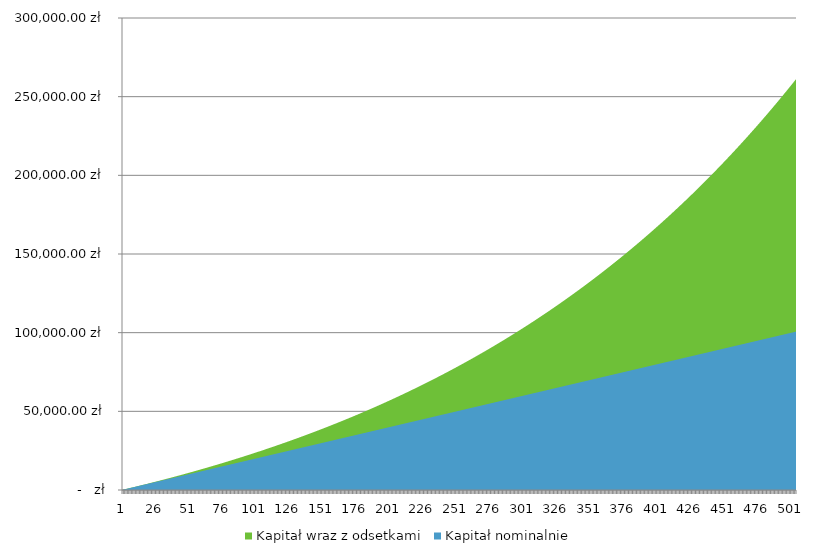
| Category | Kapitał wraz z odsetkami | Kapitał nominalnie |
|---|---|---|
| 0 | 200.667 | 200 |
| 1 | 402.002 | 400 |
| 2 | 604.009 | 600 |
| 3 | 806.689 | 800 |
| 4 | 1010.045 | 1000 |
| 5 | 1214.078 | 1200 |
| 6 | 1418.792 | 1400 |
| 7 | 1624.188 | 1600 |
| 8 | 1830.268 | 1800 |
| 9 | 2037.036 | 2000 |
| 10 | 2244.493 | 2200 |
| 11 | 2452.641 | 2400 |
| 12 | 2661.483 | 2600 |
| 13 | 2871.021 | 2800 |
| 14 | 3081.258 | 3000 |
| 15 | 3292.196 | 3200 |
| 16 | 3503.836 | 3400 |
| 17 | 3716.182 | 3600 |
| 18 | 3929.236 | 3800 |
| 19 | 4143 | 4000 |
| 20 | 4357.477 | 4200 |
| 21 | 4572.669 | 4400 |
| 22 | 4788.578 | 4600 |
| 23 | 5005.206 | 4800 |
| 24 | 5222.557 | 5000 |
| 25 | 5440.632 | 5200 |
| 26 | 5659.434 | 5400 |
| 27 | 5878.966 | 5600 |
| 28 | 6099.229 | 5800 |
| 29 | 6320.226 | 6000 |
| 30 | 6541.96 | 6200 |
| 31 | 6764.434 | 6400 |
| 32 | 6987.648 | 6600 |
| 33 | 7211.607 | 6800 |
| 34 | 7436.312 | 7000 |
| 35 | 7661.767 | 7200 |
| 36 | 7887.973 | 7400 |
| 37 | 8114.933 | 7600 |
| 38 | 8342.649 | 7800 |
| 39 | 8571.125 | 8000 |
| 40 | 8800.362 | 8200 |
| 41 | 9030.363 | 8400 |
| 42 | 9261.131 | 8600 |
| 43 | 9492.668 | 8800 |
| 44 | 9724.977 | 9000 |
| 45 | 9958.06 | 9200 |
| 46 | 10191.92 | 9400 |
| 47 | 10426.56 | 9600 |
| 48 | 10661.982 | 9800 |
| 49 | 10898.188 | 10000 |
| 50 | 11135.182 | 10200 |
| 51 | 11372.966 | 10400 |
| 52 | 11611.543 | 10600 |
| 53 | 11850.915 | 10800 |
| 54 | 12091.084 | 11000 |
| 55 | 12332.055 | 11200 |
| 56 | 12573.828 | 11400 |
| 57 | 12816.408 | 11600 |
| 58 | 13059.796 | 11800 |
| 59 | 13303.995 | 12000 |
| 60 | 13549.008 | 12200 |
| 61 | 13794.838 | 12400 |
| 62 | 14041.488 | 12600 |
| 63 | 14288.959 | 12800 |
| 64 | 14537.256 | 13000 |
| 65 | 14786.38 | 13200 |
| 66 | 15036.335 | 13400 |
| 67 | 15287.122 | 13600 |
| 68 | 15538.746 | 13800 |
| 69 | 15791.209 | 14000 |
| 70 | 16044.513 | 14200 |
| 71 | 16298.661 | 14400 |
| 72 | 16553.657 | 14600 |
| 73 | 16809.502 | 14800 |
| 74 | 17066.201 | 15000 |
| 75 | 17323.755 | 15200 |
| 76 | 17582.167 | 15400 |
| 77 | 17841.441 | 15600 |
| 78 | 18101.579 | 15800 |
| 79 | 18362.584 | 16000 |
| 80 | 18624.46 | 16200 |
| 81 | 18887.208 | 16400 |
| 82 | 19150.832 | 16600 |
| 83 | 19415.335 | 16800 |
| 84 | 19680.719 | 17000 |
| 85 | 19946.988 | 17200 |
| 86 | 20214.145 | 17400 |
| 87 | 20482.192 | 17600 |
| 88 | 20751.133 | 17800 |
| 89 | 21020.97 | 18000 |
| 90 | 21291.706 | 18200 |
| 91 | 21563.345 | 18400 |
| 92 | 21835.89 | 18600 |
| 93 | 22109.343 | 18800 |
| 94 | 22383.707 | 19000 |
| 95 | 22658.986 | 19200 |
| 96 | 22935.183 | 19400 |
| 97 | 23212.3 | 19600 |
| 98 | 23490.341 | 19800 |
| 99 | 23769.309 | 20000 |
| 100 | 24049.207 | 20200 |
| 101 | 24330.037 | 20400 |
| 102 | 24611.804 | 20600 |
| 103 | 24894.51 | 20800 |
| 104 | 25178.158 | 21000 |
| 105 | 25462.752 | 21200 |
| 106 | 25748.295 | 21400 |
| 107 | 26034.789 | 21600 |
| 108 | 26322.238 | 21800 |
| 109 | 26610.646 | 22000 |
| 110 | 26900.015 | 22200 |
| 111 | 27190.348 | 22400 |
| 112 | 27481.649 | 22600 |
| 113 | 27773.921 | 22800 |
| 114 | 28067.168 | 23000 |
| 115 | 28361.392 | 23200 |
| 116 | 28656.596 | 23400 |
| 117 | 28952.785 | 23600 |
| 118 | 29249.961 | 23800 |
| 119 | 29548.127 | 24000 |
| 120 | 29847.288 | 24200 |
| 121 | 30147.446 | 24400 |
| 122 | 30448.604 | 24600 |
| 123 | 30750.766 | 24800 |
| 124 | 31053.935 | 25000 |
| 125 | 31358.115 | 25200 |
| 126 | 31663.308 | 25400 |
| 127 | 31969.519 | 25600 |
| 128 | 32276.751 | 25800 |
| 129 | 32585.007 | 26000 |
| 130 | 32894.29 | 26200 |
| 131 | 33204.605 | 26400 |
| 132 | 33515.953 | 26600 |
| 133 | 33828.34 | 26800 |
| 134 | 34141.768 | 27000 |
| 135 | 34456.24 | 27200 |
| 136 | 34771.761 | 27400 |
| 137 | 35088.334 | 27600 |
| 138 | 35405.961 | 27800 |
| 139 | 35724.648 | 28000 |
| 140 | 36044.397 | 28200 |
| 141 | 36365.211 | 28400 |
| 142 | 36687.095 | 28600 |
| 143 | 37010.052 | 28800 |
| 144 | 37334.086 | 29000 |
| 145 | 37659.2 | 29200 |
| 146 | 37985.397 | 29400 |
| 147 | 38312.681 | 29600 |
| 148 | 38641.057 | 29800 |
| 149 | 38970.527 | 30000 |
| 150 | 39301.096 | 30200 |
| 151 | 39632.766 | 30400 |
| 152 | 39965.542 | 30600 |
| 153 | 40299.427 | 30800 |
| 154 | 40634.425 | 31000 |
| 155 | 40970.54 | 31200 |
| 156 | 41307.775 | 31400 |
| 157 | 41646.134 | 31600 |
| 158 | 41985.621 | 31800 |
| 159 | 42326.24 | 32000 |
| 160 | 42667.994 | 32200 |
| 161 | 43010.888 | 32400 |
| 162 | 43354.924 | 32600 |
| 163 | 43700.107 | 32800 |
| 164 | 44046.441 | 33000 |
| 165 | 44393.929 | 33200 |
| 166 | 44742.575 | 33400 |
| 167 | 45092.384 | 33600 |
| 168 | 45443.358 | 33800 |
| 169 | 45795.503 | 34000 |
| 170 | 46148.821 | 34200 |
| 171 | 46503.317 | 34400 |
| 172 | 46858.995 | 34600 |
| 173 | 47215.858 | 34800 |
| 174 | 47573.911 | 35000 |
| 175 | 47933.158 | 35200 |
| 176 | 48293.601 | 35400 |
| 177 | 48655.247 | 35600 |
| 178 | 49018.098 | 35800 |
| 179 | 49382.158 | 36000 |
| 180 | 49747.432 | 36200 |
| 181 | 50113.923 | 36400 |
| 182 | 50481.636 | 36600 |
| 183 | 50850.575 | 36800 |
| 184 | 51220.744 | 37000 |
| 185 | 51592.146 | 37200 |
| 186 | 51964.787 | 37400 |
| 187 | 52338.669 | 37600 |
| 188 | 52713.798 | 37800 |
| 189 | 53090.178 | 38000 |
| 190 | 53467.811 | 38200 |
| 191 | 53846.704 | 38400 |
| 192 | 54226.86 | 38600 |
| 193 | 54608.283 | 38800 |
| 194 | 54990.977 | 39000 |
| 195 | 55374.947 | 39200 |
| 196 | 55760.197 | 39400 |
| 197 | 56146.731 | 39600 |
| 198 | 56534.553 | 39800 |
| 199 | 56923.668 | 40000 |
| 200 | 57314.081 | 40200 |
| 201 | 57705.794 | 40400 |
| 202 | 58098.813 | 40600 |
| 203 | 58493.143 | 40800 |
| 204 | 58888.787 | 41000 |
| 205 | 59285.749 | 41200 |
| 206 | 59684.035 | 41400 |
| 207 | 60083.649 | 41600 |
| 208 | 60484.594 | 41800 |
| 209 | 60886.876 | 42000 |
| 210 | 61290.499 | 42200 |
| 211 | 61695.467 | 42400 |
| 212 | 62101.786 | 42600 |
| 213 | 62509.458 | 42800 |
| 214 | 62918.49 | 43000 |
| 215 | 63328.885 | 43200 |
| 216 | 63740.648 | 43400 |
| 217 | 64153.783 | 43600 |
| 218 | 64568.296 | 43800 |
| 219 | 64984.19 | 44000 |
| 220 | 65401.471 | 44200 |
| 221 | 65820.142 | 44400 |
| 222 | 66240.209 | 44600 |
| 223 | 66661.677 | 44800 |
| 224 | 67084.549 | 45000 |
| 225 | 67508.831 | 45200 |
| 226 | 67934.527 | 45400 |
| 227 | 68361.642 | 45600 |
| 228 | 68790.181 | 45800 |
| 229 | 69220.148 | 46000 |
| 230 | 69651.549 | 46200 |
| 231 | 70084.387 | 46400 |
| 232 | 70518.668 | 46600 |
| 233 | 70954.397 | 46800 |
| 234 | 71391.579 | 47000 |
| 235 | 71830.217 | 47200 |
| 236 | 72270.318 | 47400 |
| 237 | 72711.886 | 47600 |
| 238 | 73154.925 | 47800 |
| 239 | 73599.442 | 48000 |
| 240 | 74045.44 | 48200 |
| 241 | 74492.925 | 48400 |
| 242 | 74941.901 | 48600 |
| 243 | 75392.374 | 48800 |
| 244 | 75844.349 | 49000 |
| 245 | 76297.83 | 49200 |
| 246 | 76752.822 | 49400 |
| 247 | 77209.332 | 49600 |
| 248 | 77667.363 | 49800 |
| 249 | 78126.921 | 50000 |
| 250 | 78588.011 | 50200 |
| 251 | 79050.637 | 50400 |
| 252 | 79514.806 | 50600 |
| 253 | 79980.522 | 50800 |
| 254 | 80447.791 | 51000 |
| 255 | 80916.617 | 51200 |
| 256 | 81387.005 | 51400 |
| 257 | 81858.962 | 51600 |
| 258 | 82332.492 | 51800 |
| 259 | 82807.6 | 52000 |
| 260 | 83284.292 | 52200 |
| 261 | 83762.573 | 52400 |
| 262 | 84242.448 | 52600 |
| 263 | 84723.923 | 52800 |
| 264 | 85207.003 | 53000 |
| 265 | 85691.693 | 53200 |
| 266 | 86177.999 | 53400 |
| 267 | 86665.925 | 53600 |
| 268 | 87155.478 | 53800 |
| 269 | 87646.663 | 54000 |
| 270 | 88139.485 | 54200 |
| 271 | 88633.95 | 54400 |
| 272 | 89130.064 | 54600 |
| 273 | 89627.83 | 54800 |
| 274 | 90127.257 | 55000 |
| 275 | 90628.347 | 55200 |
| 276 | 91131.109 | 55400 |
| 277 | 91635.546 | 55600 |
| 278 | 92141.664 | 55800 |
| 279 | 92649.47 | 56000 |
| 280 | 93158.968 | 56200 |
| 281 | 93670.164 | 56400 |
| 282 | 94183.065 | 56600 |
| 283 | 94697.675 | 56800 |
| 284 | 95214.001 | 57000 |
| 285 | 95732.047 | 57200 |
| 286 | 96251.821 | 57400 |
| 287 | 96773.327 | 57600 |
| 288 | 97296.571 | 57800 |
| 289 | 97821.56 | 58000 |
| 290 | 98348.298 | 58200 |
| 291 | 98876.793 | 58400 |
| 292 | 99407.049 | 58600 |
| 293 | 99939.072 | 58800 |
| 294 | 100472.869 | 59000 |
| 295 | 101008.445 | 59200 |
| 296 | 101545.807 | 59400 |
| 297 | 102084.96 | 59600 |
| 298 | 102625.909 | 59800 |
| 299 | 103168.663 | 60000 |
| 300 | 103713.225 | 60200 |
| 301 | 104259.602 | 60400 |
| 302 | 104807.801 | 60600 |
| 303 | 105357.827 | 60800 |
| 304 | 105909.686 | 61000 |
| 305 | 106463.385 | 61200 |
| 306 | 107018.93 | 61400 |
| 307 | 107576.326 | 61600 |
| 308 | 108135.581 | 61800 |
| 309 | 108696.699 | 62000 |
| 310 | 109259.688 | 62200 |
| 311 | 109824.554 | 62400 |
| 312 | 110391.302 | 62600 |
| 313 | 110959.94 | 62800 |
| 314 | 111530.473 | 63000 |
| 315 | 112102.908 | 63200 |
| 316 | 112677.251 | 63400 |
| 317 | 113253.509 | 63600 |
| 318 | 113831.687 | 63800 |
| 319 | 114411.793 | 64000 |
| 320 | 114993.832 | 64200 |
| 321 | 115577.811 | 64400 |
| 322 | 116163.737 | 64600 |
| 323 | 116751.617 | 64800 |
| 324 | 117341.455 | 65000 |
| 325 | 117933.26 | 65200 |
| 326 | 118527.038 | 65400 |
| 327 | 119122.794 | 65600 |
| 328 | 119720.537 | 65800 |
| 329 | 120320.272 | 66000 |
| 330 | 120922.006 | 66200 |
| 331 | 121525.746 | 66400 |
| 332 | 122131.499 | 66600 |
| 333 | 122739.271 | 66800 |
| 334 | 123349.068 | 67000 |
| 335 | 123960.898 | 67200 |
| 336 | 124574.768 | 67400 |
| 337 | 125190.684 | 67600 |
| 338 | 125808.653 | 67800 |
| 339 | 126428.682 | 68000 |
| 340 | 127050.777 | 68200 |
| 341 | 127674.947 | 68400 |
| 342 | 128301.196 | 68600 |
| 343 | 128929.534 | 68800 |
| 344 | 129559.966 | 69000 |
| 345 | 130192.499 | 69200 |
| 346 | 130827.14 | 69400 |
| 347 | 131463.898 | 69600 |
| 348 | 132102.777 | 69800 |
| 349 | 132743.786 | 70000 |
| 350 | 133386.932 | 70200 |
| 351 | 134032.222 | 70400 |
| 352 | 134679.663 | 70600 |
| 353 | 135329.262 | 70800 |
| 354 | 135981.026 | 71000 |
| 355 | 136634.963 | 71200 |
| 356 | 137291.079 | 71400 |
| 357 | 137949.383 | 71600 |
| 358 | 138609.881 | 71800 |
| 359 | 139272.58 | 72000 |
| 360 | 139937.489 | 72200 |
| 361 | 140604.614 | 72400 |
| 362 | 141273.963 | 72600 |
| 363 | 141945.543 | 72800 |
| 364 | 142619.361 | 73000 |
| 365 | 143295.426 | 73200 |
| 366 | 143973.744 | 73400 |
| 367 | 144654.323 | 73600 |
| 368 | 145337.171 | 73800 |
| 369 | 146022.295 | 74000 |
| 370 | 146709.702 | 74200 |
| 371 | 147399.401 | 74400 |
| 372 | 148091.399 | 74600 |
| 373 | 148785.704 | 74800 |
| 374 | 149482.323 | 75000 |
| 375 | 150181.264 | 75200 |
| 376 | 150882.535 | 75400 |
| 377 | 151586.143 | 75600 |
| 378 | 152292.097 | 75800 |
| 379 | 153000.404 | 76000 |
| 380 | 153711.072 | 76200 |
| 381 | 154424.109 | 76400 |
| 382 | 155139.523 | 76600 |
| 383 | 155857.321 | 76800 |
| 384 | 156577.512 | 77000 |
| 385 | 157300.104 | 77200 |
| 386 | 158025.104 | 77400 |
| 387 | 158752.521 | 77600 |
| 388 | 159482.363 | 77800 |
| 389 | 160214.638 | 78000 |
| 390 | 160949.353 | 78200 |
| 391 | 161686.517 | 78400 |
| 392 | 162426.139 | 78600 |
| 393 | 163168.226 | 78800 |
| 394 | 163912.787 | 79000 |
| 395 | 164659.83 | 79200 |
| 396 | 165409.362 | 79400 |
| 397 | 166161.394 | 79600 |
| 398 | 166915.932 | 79800 |
| 399 | 167672.985 | 80000 |
| 400 | 168432.561 | 80200 |
| 401 | 169194.67 | 80400 |
| 402 | 169959.319 | 80600 |
| 403 | 170726.517 | 80800 |
| 404 | 171496.272 | 81000 |
| 405 | 172268.593 | 81200 |
| 406 | 173043.488 | 81400 |
| 407 | 173820.966 | 81600 |
| 408 | 174601.036 | 81800 |
| 409 | 175383.706 | 82000 |
| 410 | 176168.985 | 82200 |
| 411 | 176956.882 | 82400 |
| 412 | 177747.405 | 82600 |
| 413 | 178540.563 | 82800 |
| 414 | 179336.365 | 83000 |
| 415 | 180134.819 | 83200 |
| 416 | 180935.935 | 83400 |
| 417 | 181739.722 | 83600 |
| 418 | 182546.187 | 83800 |
| 419 | 183355.341 | 84000 |
| 420 | 184167.192 | 84200 |
| 421 | 184981.75 | 84400 |
| 422 | 185799.022 | 84600 |
| 423 | 186619.019 | 84800 |
| 424 | 187441.749 | 85000 |
| 425 | 188267.222 | 85200 |
| 426 | 189095.446 | 85400 |
| 427 | 189926.43 | 85600 |
| 428 | 190760.185 | 85800 |
| 429 | 191596.719 | 86000 |
| 430 | 192436.042 | 86200 |
| 431 | 193278.162 | 86400 |
| 432 | 194123.089 | 86600 |
| 433 | 194970.833 | 86800 |
| 434 | 195821.402 | 87000 |
| 435 | 196674.807 | 87200 |
| 436 | 197531.056 | 87400 |
| 437 | 198390.16 | 87600 |
| 438 | 199252.127 | 87800 |
| 439 | 200116.967 | 88000 |
| 440 | 200984.69 | 88200 |
| 441 | 201855.306 | 88400 |
| 442 | 202728.824 | 88600 |
| 443 | 203605.253 | 88800 |
| 444 | 204484.604 | 89000 |
| 445 | 205366.886 | 89200 |
| 446 | 206252.109 | 89400 |
| 447 | 207140.283 | 89600 |
| 448 | 208031.417 | 89800 |
| 449 | 208925.522 | 90000 |
| 450 | 209822.607 | 90200 |
| 451 | 210722.682 | 90400 |
| 452 | 211625.758 | 90600 |
| 453 | 212531.844 | 90800 |
| 454 | 213440.95 | 91000 |
| 455 | 214353.086 | 91200 |
| 456 | 215268.263 | 91400 |
| 457 | 216186.491 | 91600 |
| 458 | 217107.779 | 91800 |
| 459 | 218032.138 | 92000 |
| 460 | 218959.579 | 92200 |
| 461 | 219890.111 | 92400 |
| 462 | 220823.744 | 92600 |
| 463 | 221760.49 | 92800 |
| 464 | 222700.358 | 93000 |
| 465 | 223643.36 | 93200 |
| 466 | 224589.504 | 93400 |
| 467 | 225538.803 | 93600 |
| 468 | 226491.265 | 93800 |
| 469 | 227446.903 | 94000 |
| 470 | 228405.726 | 94200 |
| 471 | 229367.745 | 94400 |
| 472 | 230332.971 | 94600 |
| 473 | 231301.414 | 94800 |
| 474 | 232273.085 | 95000 |
| 475 | 233247.996 | 95200 |
| 476 | 234226.156 | 95400 |
| 477 | 235207.576 | 95600 |
| 478 | 236192.268 | 95800 |
| 479 | 237180.242 | 96000 |
| 480 | 238171.51 | 96200 |
| 481 | 239166.081 | 96400 |
| 482 | 240163.968 | 96600 |
| 483 | 241165.182 | 96800 |
| 484 | 242169.732 | 97000 |
| 485 | 243177.631 | 97200 |
| 486 | 244188.89 | 97400 |
| 487 | 245203.52 | 97600 |
| 488 | 246221.531 | 97800 |
| 489 | 247242.937 | 98000 |
| 490 | 248267.746 | 98200 |
| 491 | 249295.972 | 98400 |
| 492 | 250327.625 | 98600 |
| 493 | 251362.717 | 98800 |
| 494 | 252401.26 | 99000 |
| 495 | 253443.264 | 99200 |
| 496 | 254488.742 | 99400 |
| 497 | 255537.704 | 99600 |
| 498 | 256590.163 | 99800 |
| 499 | 257646.13 | 100000 |
| 500 | 258705.617 | 100200 |
| 501 | 259768.636 | 100400 |
| 502 | 260835.198 | 100600 |
| 503 | 261905.316 | 100800 |